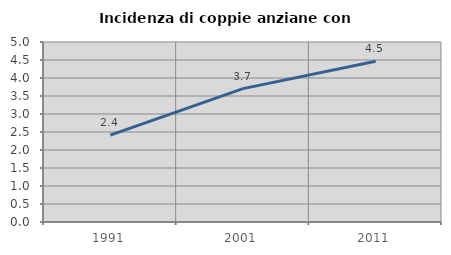
| Category | Incidenza di coppie anziane con figli |
|---|---|
| 1991.0 | 2.412 |
| 2001.0 | 3.705 |
| 2011.0 | 4.465 |